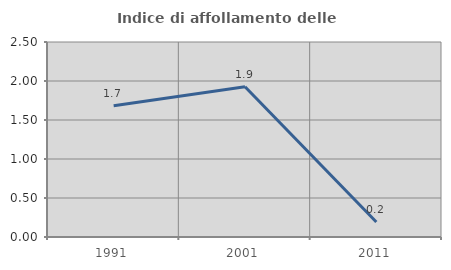
| Category | Indice di affollamento delle abitazioni  |
|---|---|
| 1991.0 | 1.682 |
| 2001.0 | 1.927 |
| 2011.0 | 0.193 |